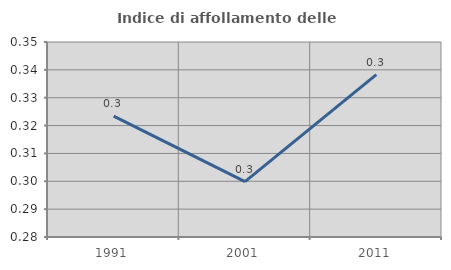
| Category | Indice di affollamento delle abitazioni  |
|---|---|
| 1991.0 | 0.323 |
| 2001.0 | 0.3 |
| 2011.0 | 0.338 |